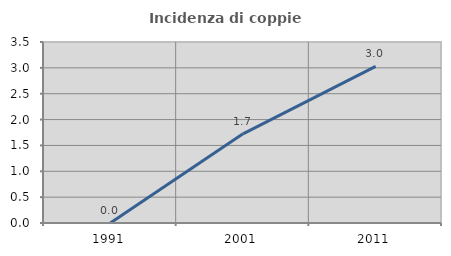
| Category | Incidenza di coppie miste |
|---|---|
| 1991.0 | 0 |
| 2001.0 | 1.724 |
| 2011.0 | 3.03 |